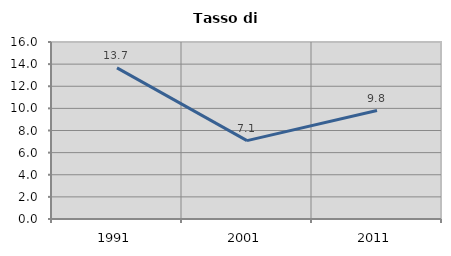
| Category | Tasso di disoccupazione   |
|---|---|
| 1991.0 | 13.656 |
| 2001.0 | 7.084 |
| 2011.0 | 9.8 |